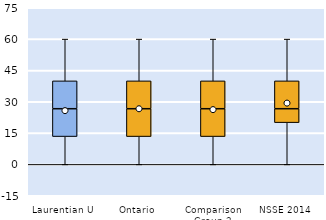
| Category | 25th | 50th | 75th |
|---|---|---|---|
| Laurentian U | 13.333 | 13.333 | 13.333 |
| Ontario | 13.333 | 13.333 | 13.333 |
| Comparison Group 2 | 13.333 | 13.333 | 13.333 |
| NSSE 2014 | 20 | 6.667 | 13.333 |